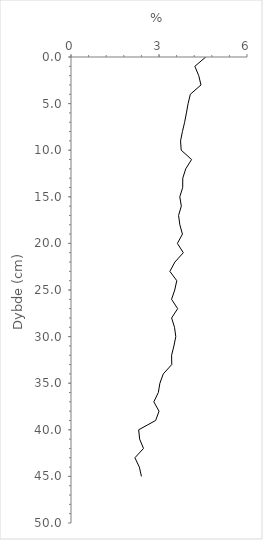
| Category | Series 0 |
|---|---|
| 4.594802829726369 | 0 |
| 4.2222931970620134 | 1 |
| 4.3549505262493735 | 2 |
| 4.430970149253772 | 3 |
| 4.0681589537220235 | 4 |
| 3.991805314129794 | 5 |
| 3.934913073068173 | 6 |
| 3.874034462270016 | 7 |
| 3.798551303256788 | 8 |
| 3.7350038413802347 | 9 |
| 3.757415952537873 | 10 |
| 4.111554779136455 | 11 |
| 3.911512080578275 | 12 |
| 3.8107014388492186 | 13 |
| 3.808015020829346 | 14 |
| 3.708824236595442 | 15 |
| 3.761130830064226 | 16 |
| 3.6669970267591148 | 17 |
| 3.7102258926400413 | 18 |
| 3.799318071115234 | 19 |
| 3.627166738634139 | 20 |
| 3.829632766652448 | 21 |
| 3.541972658456654 | 22 |
| 3.3702185024996987 | 23 |
| 3.6066778664426686 | 24 |
| 3.536683071992567 | 25 |
| 3.427841041133955 | 26 |
| 3.636058981233306 | 27 |
| 3.4306333476948088 | 28 |
| 3.5285602267926404 | 29 |
| 3.5722720831367814 | 30 |
| 3.5090463527818403 | 31 |
| 3.4295107987078084 | 32 |
| 3.435092724679124 | 33 |
| 3.1462730965047583 | 34 |
| 3.0306495882889637 | 35 |
| 2.977582568022317 | 36 |
| 2.8231328347204743 | 37 |
| 3.0012580123405312 | 38 |
| 2.8859946066899904 | 39 |
| 2.306753909282611 | 40 |
| 2.340375860861589 | 41 |
| 2.4723798148702865 | 42 |
| 2.1793701506159504 | 43 |
| 2.329846824964268 | 44 |
| 2.401512441878142 | 45 |